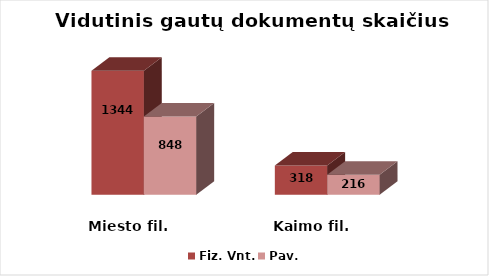
| Category | Fiz. Vnt. | Pav. |
|---|---|---|
| Miesto fil. | 1344 | 848 |
| Kaimo fil. | 318 | 216 |